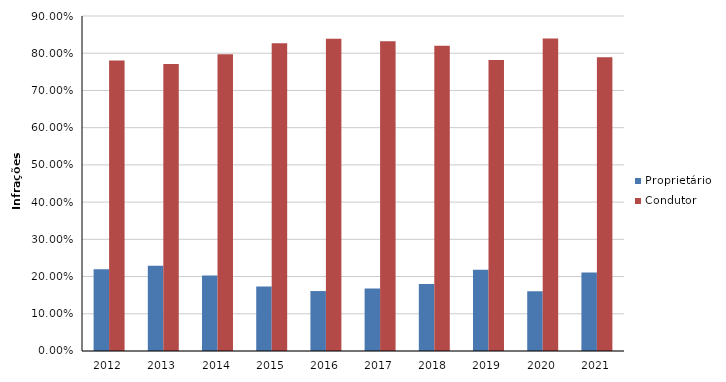
| Category | Proprietário | Condutor |
|---|---|---|
| 2012 | 0.22 | 0.78 |
| 2013 | 0.229 | 0.771 |
| 2014 | 0.203 | 0.797 |
| 2015 | 0.173 | 0.827 |
| 2016 | 0.161 | 0.839 |
| 2017 | 0.168 | 0.832 |
| 2018 | 0.18 | 0.82 |
| 2019 | 0.218 | 0.782 |
| 2020 | 0.16 | 0.84 |
| 2021 | 0.211 | 0.789 |